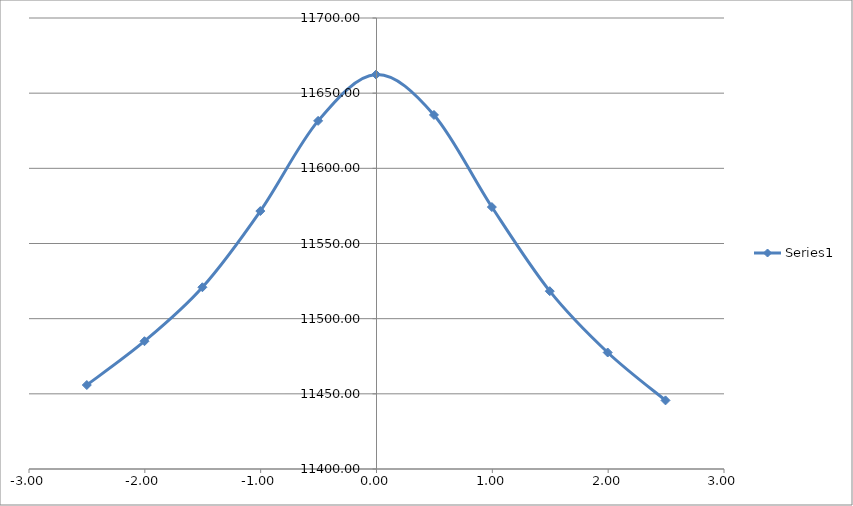
| Category | Series 0 |
|---|---|
| -2.5010000000000003 | 11455.856 |
| -2.003 | 11484.992 |
| -1.5030000000000001 | 11520.89 |
| -1.0030000000000001 | 11571.585 |
| -0.5040000000000004 | 11631.571 |
| -0.004000000000000448 | 11662.379 |
| 0.49599999999999955 | 11635.514 |
| 0.9959999999999996 | 11574.248 |
| 1.4959999999999996 | 11518.285 |
| 1.9959999999999996 | 11477.492 |
| 2.495 | 11445.63 |